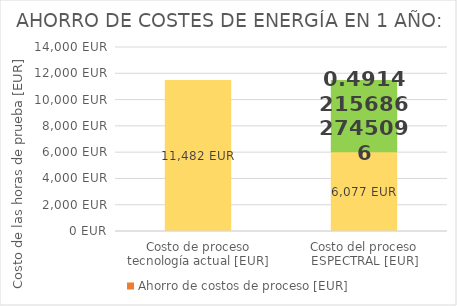
| Category | Costo de proceso tecnología actual [EUR] | Ahorro de costos de proceso [EUR] |
|---|---|---|
| Costo de proceso tecnología actual [EUR] | 11481.8 | 0 |
| Costo del proceso ESPECTRAL [EUR] | 6076.9 | 5404.9 |